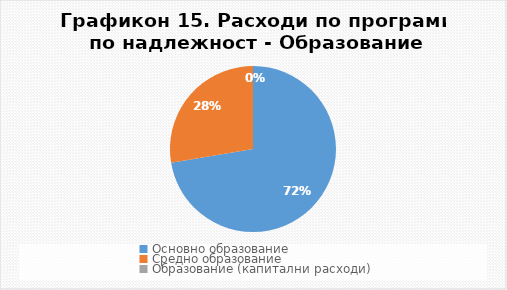
| Category | Структура |
|---|---|
| Основно образование | 72.369 |
| Средно образование | 27.631 |
| Образование (капитални расходи) | 0 |